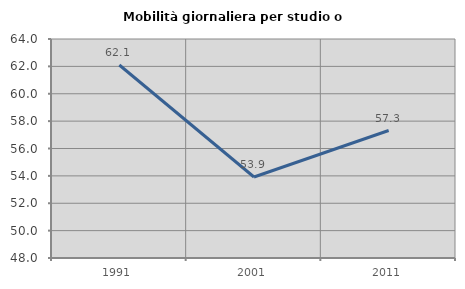
| Category | Mobilità giornaliera per studio o lavoro |
|---|---|
| 1991.0 | 62.099 |
| 2001.0 | 53.919 |
| 2011.0 | 57.315 |